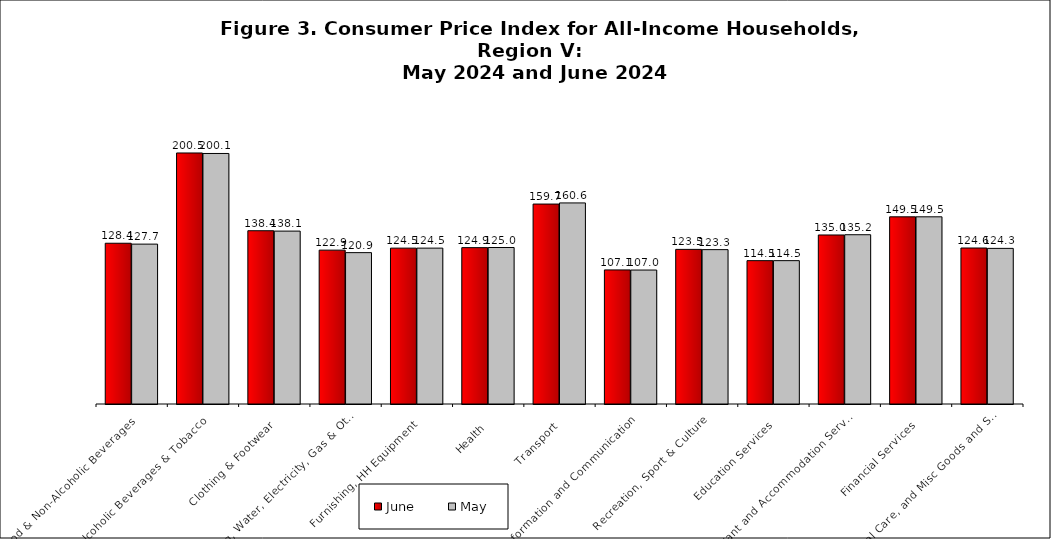
| Category | June | May |
|---|---|---|
| Food & Non-Alcoholic Beverages | 128.4 | 127.7 |
| Alcoholic Beverages & Tobacco | 200.5 | 200.1 |
| Clothing & Footwear | 138.4 | 138.1 |
| Housing, Water, Electricity, Gas & Other Fuels | 122.9 | 120.9 |
| Furnishing, HH Equipment  | 124.5 | 124.5 |
| Health | 124.9 | 125 |
| Transport | 159.7 | 160.6 |
| Information and Communication | 107.1 | 107 |
| Recreation, Sport & Culture | 123.5 | 123.3 |
| Education Services | 114.5 | 114.5 |
| Restaurant and Accommodation Services | 135 | 135.2 |
| Financial Services | 149.5 | 149.5 |
| Personal Care, and Misc Goods and Services | 124.6 | 124.3 |